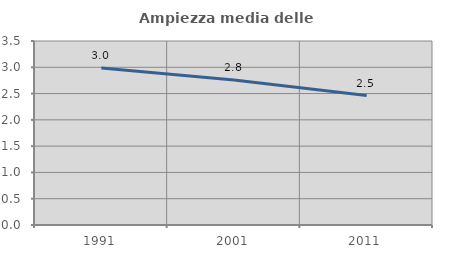
| Category | Ampiezza media delle famiglie |
|---|---|
| 1991.0 | 2.988 |
| 2001.0 | 2.758 |
| 2011.0 | 2.461 |